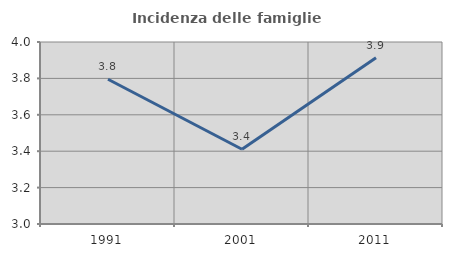
| Category | Incidenza delle famiglie numerose |
|---|---|
| 1991.0 | 3.795 |
| 2001.0 | 3.411 |
| 2011.0 | 3.913 |